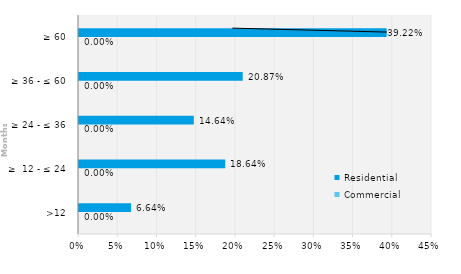
| Category | Commercial | Residential |
|---|---|---|
| >12 | 0 | 0.066 |
| ≥  12 - ≤ 24 | 0 | 0.186 |
| ≥ 24 - ≤ 36 | 0 | 0.146 |
| ≥ 36 - ≤ 60 | 0 | 0.209 |
| ≥ 60 | 0 | 0.392 |